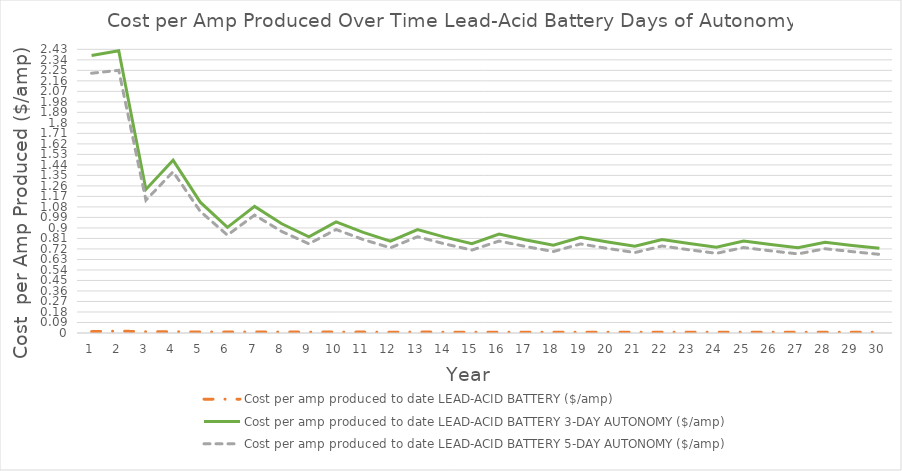
| Category | Cost per amp produced to date LEAD-ACID BATTERY ($/amp) | Cost per amp produced to date LEAD-ACID BATTERY 3-DAY AUTONOMY ($/amp) | Cost per amp produced to date LEAD-ACID BATTERY 5-DAY AUTONOMY ($/amp) |
|---|---|---|---|
| 0 | 0.012 | 2.377 | 2.225 |
| 1 | 0.016 | 2.418 | 2.25 |
| 2 | 0.01 | 1.23 | 1.138 |
| 3 | 0.011 | 1.481 | 1.381 |
| 4 | 0.009 | 1.121 | 1.042 |
| 5 | 0.008 | 0.905 | 0.839 |
| 6 | 0.009 | 1.084 | 1.01 |
| 7 | 0.008 | 0.935 | 0.869 |
| 8 | 0.008 | 0.824 | 0.764 |
| 9 | 0.008 | 0.952 | 0.887 |
| 10 | 0.008 | 0.861 | 0.8 |
| 11 | 0.007 | 0.787 | 0.73 |
| 12 | 0.008 | 0.886 | 0.825 |
| 13 | 0.007 | 0.821 | 0.763 |
| 14 | 0.007 | 0.766 | 0.711 |
| 15 | 0.007 | 0.847 | 0.788 |
| 16 | 0.007 | 0.796 | 0.74 |
| 17 | 0.007 | 0.752 | 0.698 |
| 18 | 0.007 | 0.82 | 0.763 |
| 19 | 0.007 | 0.779 | 0.724 |
| 20 | 0.007 | 0.742 | 0.689 |
| 21 | 0.007 | 0.802 | 0.745 |
| 22 | 0.007 | 0.767 | 0.713 |
| 23 | 0.007 | 0.735 | 0.683 |
| 24 | 0.007 | 0.787 | 0.732 |
| 25 | 0.007 | 0.758 | 0.704 |
| 26 | 0.007 | 0.73 | 0.678 |
| 27 | 0.007 | 0.776 | 0.722 |
| 28 | 0.007 | 0.75 | 0.697 |
| 29 | 0.007 | 0.726 | 0.674 |